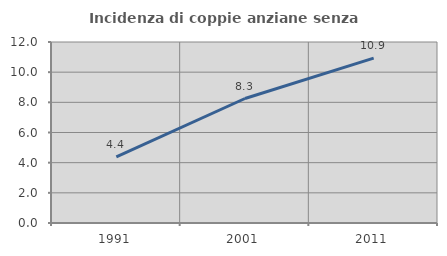
| Category | Incidenza di coppie anziane senza figli  |
|---|---|
| 1991.0 | 4.378 |
| 2001.0 | 8.254 |
| 2011.0 | 10.933 |